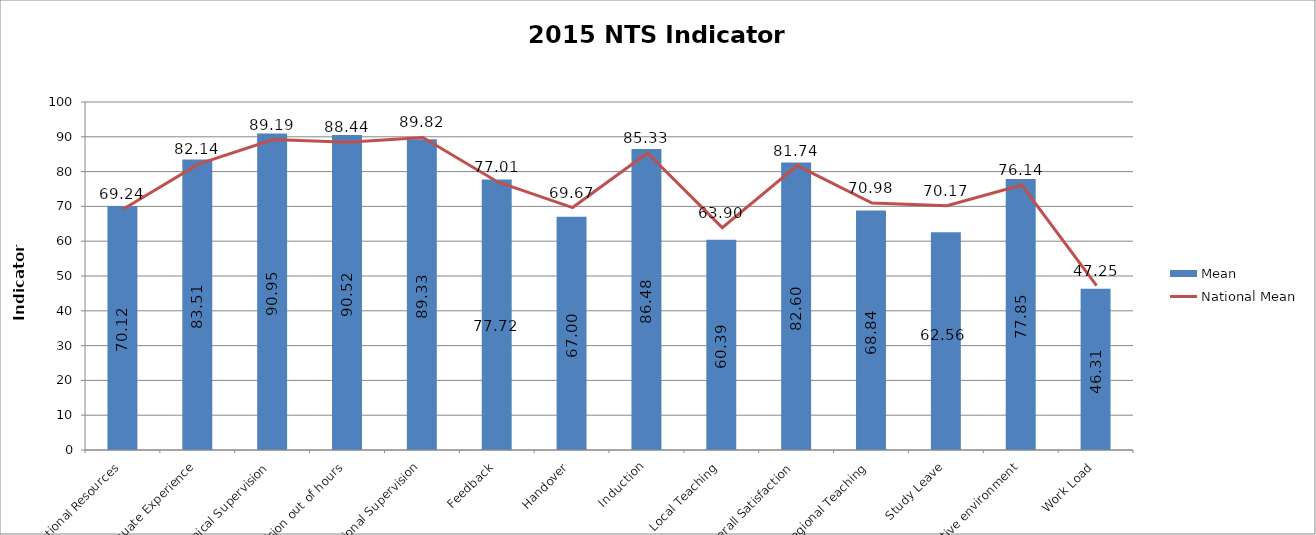
| Category | Mean |
|---|---|
| Access to Educational Resources | 70.12 |
| Adequate Experience | 83.51 |
| Clinical Supervision | 90.95 |
| Clinical Supervision out of hours | 90.52 |
| Educational Supervision | 89.33 |
| Feedback | 77.72 |
| Handover | 67 |
| Induction | 86.48 |
| Local Teaching | 60.39 |
| Overall Satisfaction | 82.6 |
| Regional Teaching | 68.84 |
| Study Leave | 62.56 |
| Supportive environment | 77.85 |
| Work Load | 46.31 |